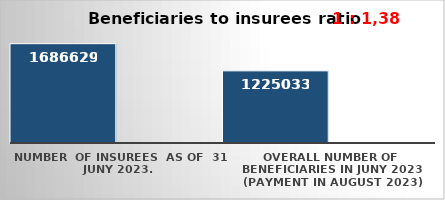
| Category | Series 0 | Series 1 |
|---|---|---|
| NUMBER  of insurees  as of  31 Juny 2023. | 1686629 |  |
| OVERALL number of beneficiaries in Juny 2023 (payment in August 2023) | 1225033 |  |